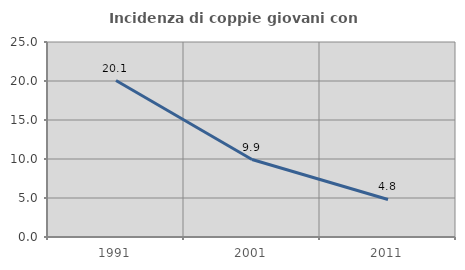
| Category | Incidenza di coppie giovani con figli |
|---|---|
| 1991.0 | 20.064 |
| 2001.0 | 9.932 |
| 2011.0 | 4.815 |